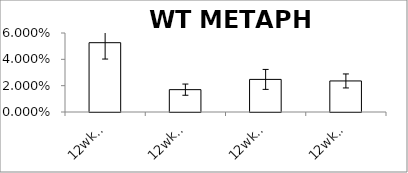
| Category | METAPH |
|---|---|
| 12wk SHAM | 0.053 |
| 12wk OVX | 0.017 |
| 12wk OVX+10ng OGP | 0.025 |
| 12wk OVX+100ng OGP | 0.024 |